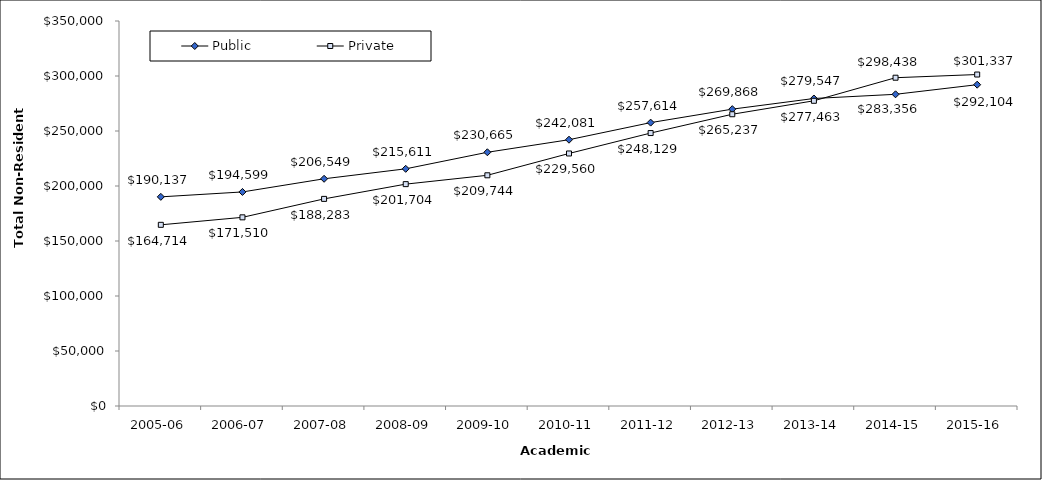
| Category | Public | Private |
|---|---|---|
| 2005-06 | 190137 | 164714 |
| 2006-07 | 194599 | 171510 |
| 2007-08 | 206549 | 188283 |
| 2008-09 | 215611 | 201704 |
| 2009-10 | 230665 | 209744 |
| 2010-11 | 242081 | 229560 |
| 2011-12 | 257614 | 248129 |
| 2012-13 | 269868 | 265237 |
| 2013-14 | 279547 | 277463 |
| 2014-15 | 283356 | 298438 |
| 2015-16 | 292103.97 | 301337.21 |